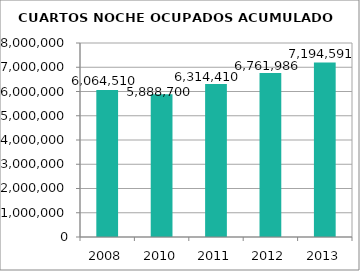
| Category | CUARTOS NOCHE OCUPADOS ACUMULADO |
|---|---|
| 2008.0 | 6064510 |
| 2010.0 | 5888700 |
| 2011.0 | 6314410 |
| 2012.0 | 6761986 |
| 2013.0 | 7194591 |